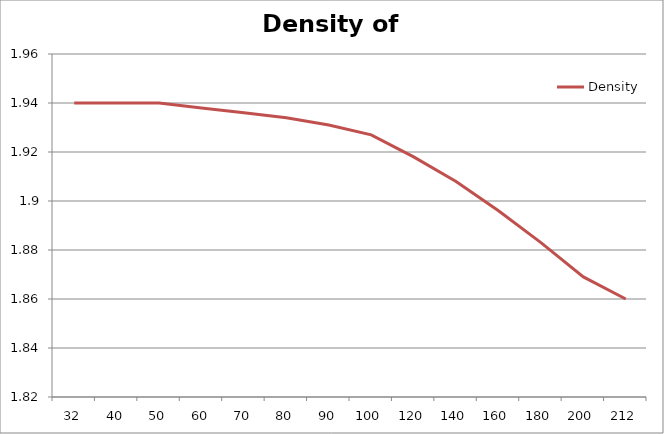
| Category | Density |
|---|---|
| 32.0 | 1.94 |
| 40.0 | 1.94 |
| 50.0 | 1.94 |
| 60.0 | 1.938 |
| 70.0 | 1.936 |
| 80.0 | 1.934 |
| 90.0 | 1.931 |
| 100.0 | 1.927 |
| 120.0 | 1.918 |
| 140.0 | 1.908 |
| 160.0 | 1.896 |
| 180.0 | 1.883 |
| 200.0 | 1.869 |
| 212.0 | 1.86 |